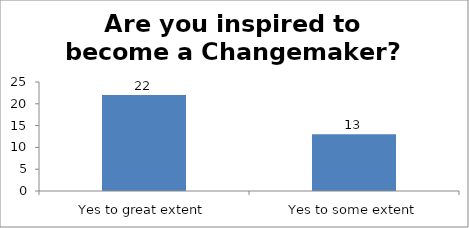
| Category | Are you inspired to become a Changemaker?   |
|---|---|
| Yes to great extent | 22 |
| Yes to some extent | 13 |